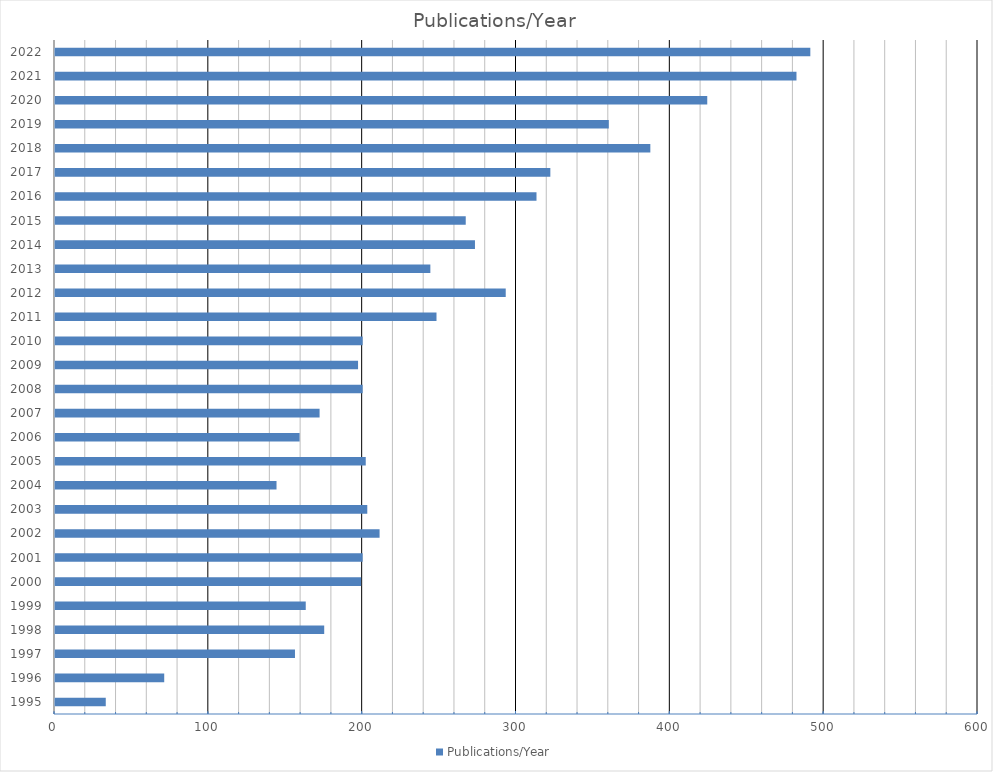
| Category | Publications/Year |
|---|---|
| 1995.0 | 33 |
| 1996.0 | 71 |
| 1997.0 | 156 |
| 1998.0 | 175 |
| 1999.0 | 163 |
| 2000.0 | 199 |
| 2001.0 | 200 |
| 2002.0 | 211 |
| 2003.0 | 203 |
| 2004.0 | 144 |
| 2005.0 | 202 |
| 2006.0 | 159 |
| 2007.0 | 172 |
| 2008.0 | 200 |
| 2009.0 | 197 |
| 2010.0 | 200 |
| 2011.0 | 248 |
| 2012.0 | 293 |
| 2013.0 | 244 |
| 2014.0 | 273 |
| 2015.0 | 267 |
| 2016.0 | 313 |
| 2017.0 | 322 |
| 2018.0 | 387 |
| 2019.0 | 360 |
| 2020.0 | 424 |
| 2021.0 | 482 |
| 2022.0 | 491 |